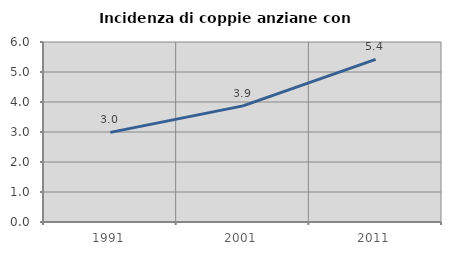
| Category | Incidenza di coppie anziane con figli |
|---|---|
| 1991.0 | 2.988 |
| 2001.0 | 3.872 |
| 2011.0 | 5.422 |